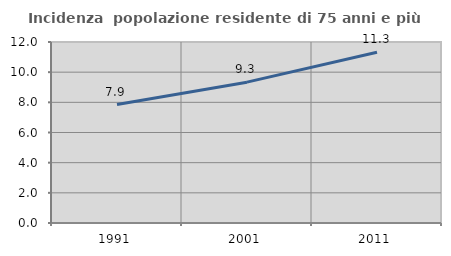
| Category | Incidenza  popolazione residente di 75 anni e più |
|---|---|
| 1991.0 | 7.855 |
| 2001.0 | 9.337 |
| 2011.0 | 11.32 |